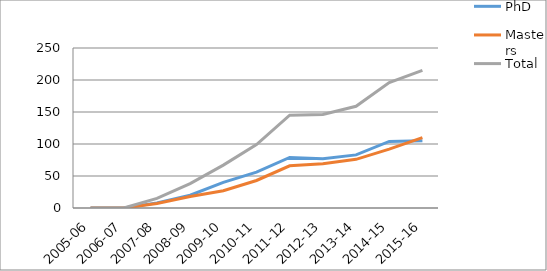
| Category | PhD | Masters | Total  |
|---|---|---|---|
| 2005-06 | 0 | 0 | 0 |
| 2006-07 | 0 | 0 | 0 |
| 2007-08 | 8 | 7 | 15 |
| 2008-09 | 20 | 18 | 38 |
| 2009-10 | 40 | 27 | 67 |
| 2010-11 | 56 | 43 | 99 |
| 2011-12 | 79 | 66 | 145 |
| 2012-13 | 77 | 69 | 146 |
| 2013-14 | 83 | 76 | 159 |
| 2014-15 | 104 | 92 | 196 |
| 2015-16 | 105 | 110 | 215 |